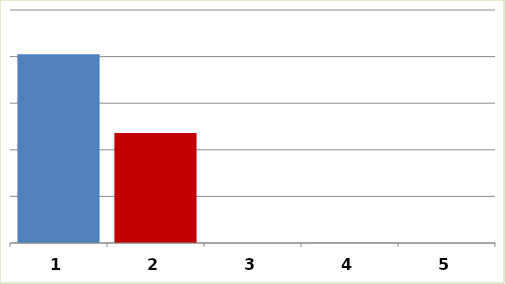
| Category | Series 0 |
|---|---|
| 0 | 20241916 |
| 1 | 11796392 |
| 2 | 0 |
| 3 | 36000 |
| 4 | 0 |